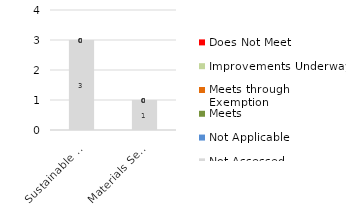
| Category | Not Assessed | Not Applicable | Meets | Meets through  Exemption | Improvements Underway | Does Not Meet |
|---|---|---|---|---|---|---|
| Sustainable Sites | 3 | 0 | 0 | 0 | 0 | 0 |
| Materials Selection | 1 | 0 | 0 | 0 | 0 | 0 |